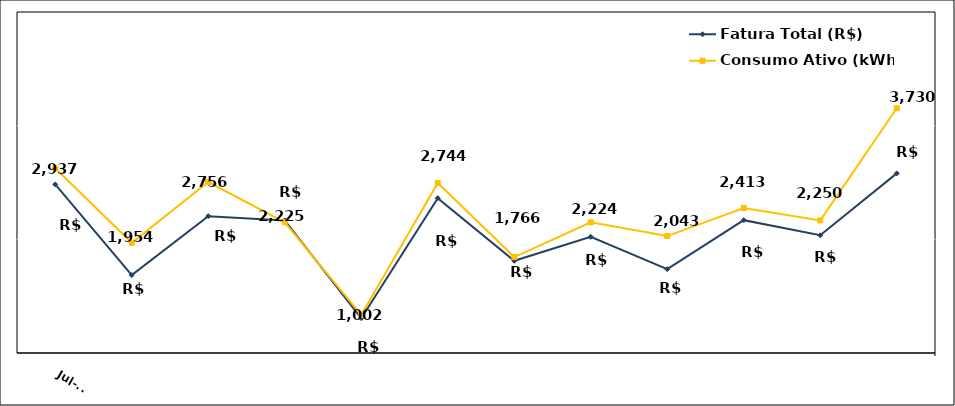
| Category | Fatura Total (R$) | Consumo Ativo (kWh) |
|---|---|---|
| 2023-07-01 | 2724.87 | 2937 |
| 2023-08-01 | 1528.84 | 1954 |
| 2023-09-01 | 2305.77 | 2756 |
| 2023-10-01 | 2249.9 | 2225 |
| 2023-11-01 | 958.94 | 1002 |
| 2023-12-01 | 2543.53 | 2744 |
| 2024-01-01 | 1716.82 | 1766 |
| 2024-02-01 | 2032.83 | 2224 |
| 2024-03-01 | 1606.39 | 2043 |
| 2024-04-01 | 2252.83 | 2413 |
| 2024-05-01 | 2053.37 | 2250 |
| 2024-06-01 | 2870.23 | 3730 |